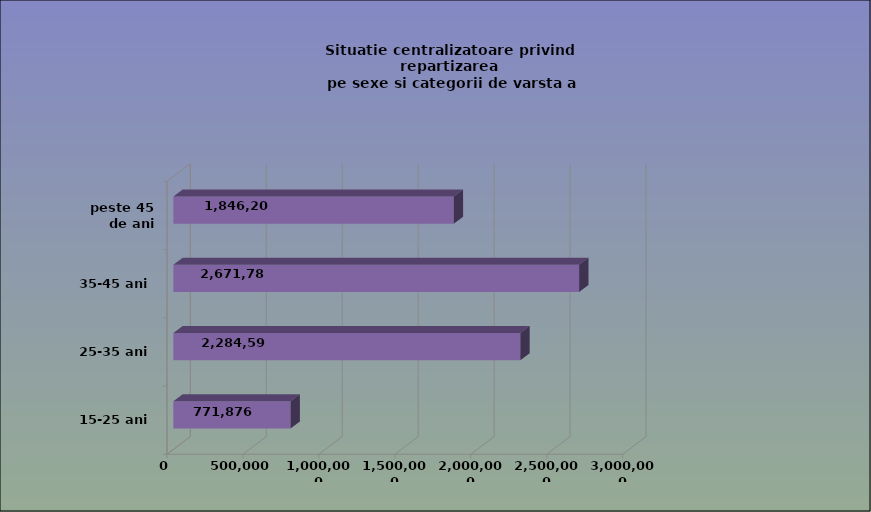
| Category | 15-25 ani 25-35 ani 35-45 ani peste 45 de ani |
|---|---|
| 15-25 ani | 771876 |
| 25-35 ani | 2284595 |
| 35-45 ani | 2671789 |
| peste 45 de ani | 1846206 |